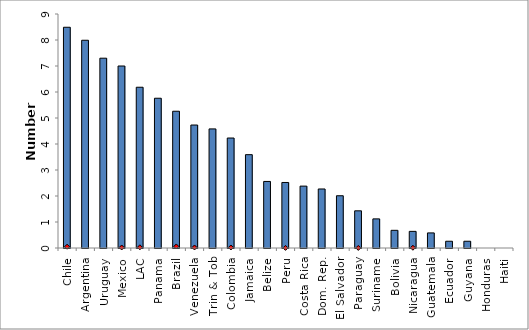
| Category | 2008 |
|---|---|
| Chile | 8.49 |
| Argentina | 7.99 |
| Uruguay | 7.3 |
| Mexico | 7 |
| LAC | 6.183 |
| Panama | 5.76 |
| Brazil | 5.26 |
| Venezuela | 4.73 |
| Trin & Tob | 4.58 |
| Colombia | 4.23 |
| Jamaica | 3.59 |
| Belize | 2.56 |
| Peru | 2.52 |
| Costa Rica | 2.38 |
| Dom. Rep. | 2.27 |
| El Salvador | 2.01 |
| Paraguay | 1.43 |
| Suriname | 1.12 |
| Bolivia | 0.68 |
| Nicaragua | 0.64 |
| Guatemala | 0.58 |
| Ecuador | 0.26 |
| Guyana | 0.26 |
| Honduras | 0 |
| Haiti | 0 |